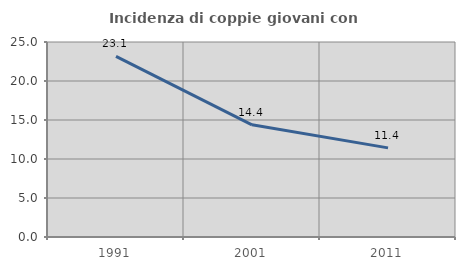
| Category | Incidenza di coppie giovani con figli |
|---|---|
| 1991.0 | 23.148 |
| 2001.0 | 14.385 |
| 2011.0 | 11.429 |